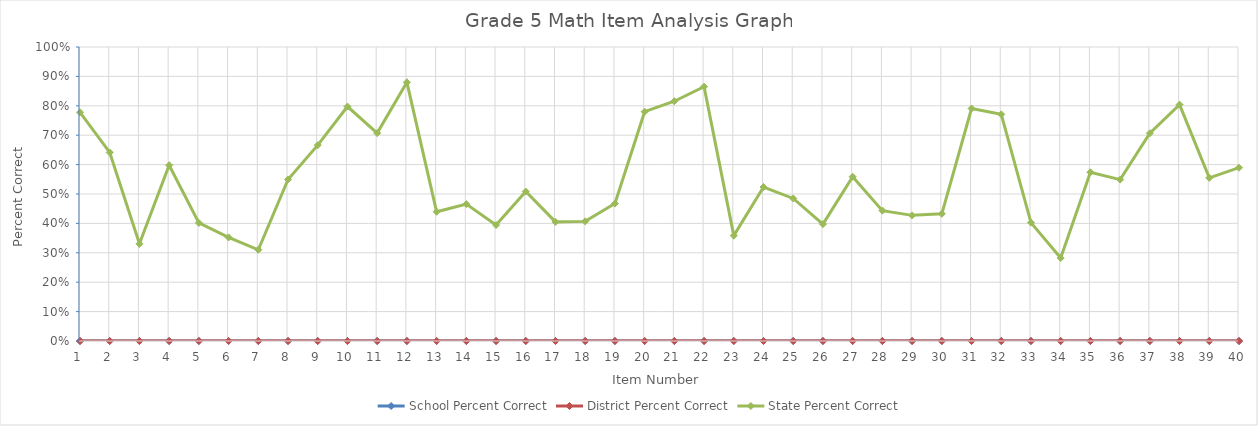
| Category | School Percent Correct | District Percent Correct | State Percent Correct |
|---|---|---|---|
| 1.0 | 0 | 0 | 0.778 |
| 2.0 | 0 | 0 | 0.641 |
| 3.0 | 0 | 0 | 0.33 |
| 4.0 | 0 | 0 | 0.598 |
| 5.0 | 0 | 0 | 0.402 |
| 6.0 | 0 | 0 | 0.352 |
| 7.0 | 0 | 0 | 0.31 |
| 8.0 | 0 | 0 | 0.549 |
| 9.0 | 0 | 0 | 0.666 |
| 10.0 | 0 | 0 | 0.797 |
| 11.0 | 0 | 0 | 0.707 |
| 12.0 | 0 | 0 | 0.88 |
| 13.0 | 0 | 0 | 0.439 |
| 14.0 | 0 | 0 | 0.466 |
| 15.0 | 0 | 0 | 0.394 |
| 16.0 | 0 | 0 | 0.508 |
| 17.0 | 0 | 0 | 0.405 |
| 18.0 | 0 | 0 | 0.407 |
| 19.0 | 0 | 0 | 0.467 |
| 20.0 | 0 | 0 | 0.78 |
| 21.0 | 0 | 0 | 0.816 |
| 22.0 | 0 | 0 | 0.865 |
| 23.0 | 0 | 0 | 0.359 |
| 24.0 | 0 | 0 | 0.524 |
| 25.0 | 0 | 0 | 0.485 |
| 26.0 | 0 | 0 | 0.398 |
| 27.0 | 0 | 0 | 0.559 |
| 28.0 | 0 | 0 | 0.443 |
| 29.0 | 0 | 0 | 0.427 |
| 30.0 | 0 | 0 | 0.433 |
| 31.0 | 0 | 0 | 0.791 |
| 32.0 | 0 | 0 | 0.771 |
| 33.0 | 0 | 0 | 0.403 |
| 34.0 | 0 | 0 | 0.282 |
| 35.0 | 0 | 0 | 0.574 |
| 36.0 | 0 | 0 | 0.549 |
| 37.0 | 0 | 0 | 0.707 |
| 38.0 | 0 | 0 | 0.804 |
| 39.0 | 0 | 0 | 0.555 |
| 40.0 | 0 | 0 | 0.59 |